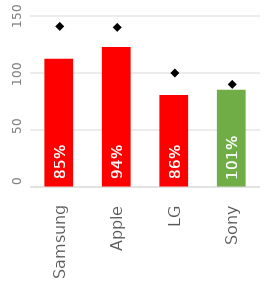
| Category | Wykonanie OK | Wykonanie nOK |
|---|---|---|
| Samsung | 0 | 120 |
| Apple | 0 | 131 |
| LG | 0 | 86 |
| Sony | 91 | 0 |